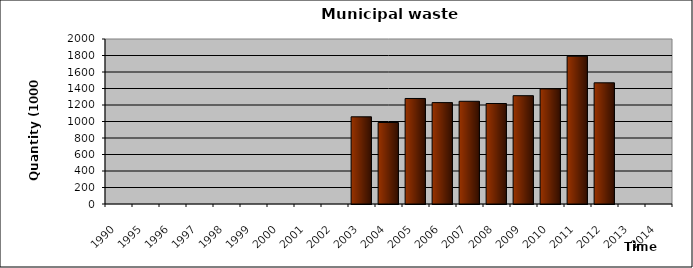
| Category | 1990 1995 1996 1997 1998 1999 2000 2001 2002 2003 2004 2005 2006 2007 2008 2009 2010 2011 2012 2013 2014 |
|---|---|
| 1990 | 0 |
| 1995 | 0 |
| 1996 | 0 |
| 1997 | 0 |
| 1998 | 0 |
| 1999 | 0 |
| 2000 | 0 |
| 2001 | 0 |
| 2002 | 0 |
| 2003 | 1057 |
| 2004 | 988 |
| 2005 | 1279 |
| 2006 | 1229 |
| 2007 | 1245 |
| 2008 | 1218 |
| 2009 | 1313 |
| 2010 | 1396 |
| 2011 | 1791 |
| 2012 | 1469 |
| 2013 | 0 |
| 2014 | 0 |